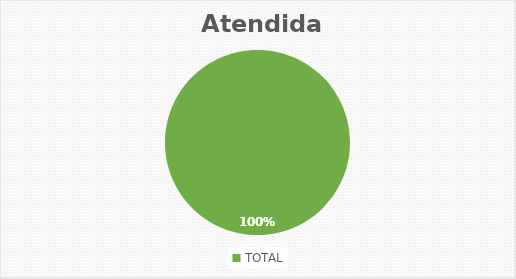
| Category | SOLICITUDES |
|---|---|
| TOTAL | 3 |